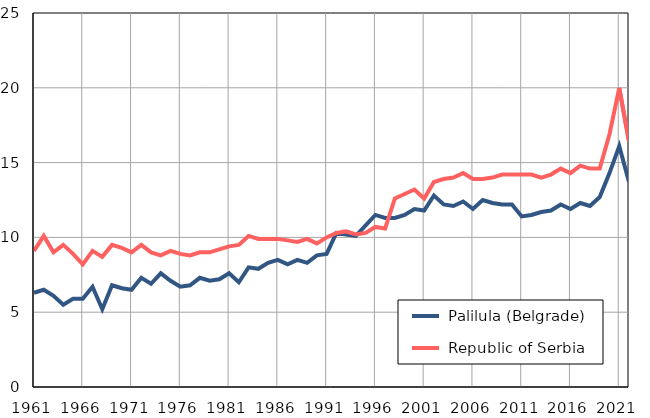
| Category |  Palilula (Belgrade) |  Republic of Serbia |
|---|---|---|
| 1961.0 | 6.3 | 9.1 |
| 1962.0 | 6.5 | 10.1 |
| 1963.0 | 6.1 | 9 |
| 1964.0 | 5.5 | 9.5 |
| 1965.0 | 5.9 | 8.9 |
| 1966.0 | 5.9 | 8.2 |
| 1967.0 | 6.7 | 9.1 |
| 1968.0 | 5.2 | 8.7 |
| 1969.0 | 6.8 | 9.5 |
| 1970.0 | 6.6 | 9.3 |
| 1971.0 | 6.5 | 9 |
| 1972.0 | 7.3 | 9.5 |
| 1973.0 | 6.9 | 9 |
| 1974.0 | 7.6 | 8.8 |
| 1975.0 | 7.1 | 9.1 |
| 1976.0 | 6.7 | 8.9 |
| 1977.0 | 6.8 | 8.8 |
| 1978.0 | 7.3 | 9 |
| 1979.0 | 7.1 | 9 |
| 1980.0 | 7.2 | 9.2 |
| 1981.0 | 7.6 | 9.4 |
| 1982.0 | 7 | 9.5 |
| 1983.0 | 8 | 10.1 |
| 1984.0 | 7.9 | 9.9 |
| 1985.0 | 8.3 | 9.9 |
| 1986.0 | 8.5 | 9.9 |
| 1987.0 | 8.2 | 9.8 |
| 1988.0 | 8.5 | 9.7 |
| 1989.0 | 8.3 | 9.9 |
| 1990.0 | 8.8 | 9.6 |
| 1991.0 | 8.9 | 10 |
| 1992.0 | 10.3 | 10.3 |
| 1993.0 | 10.2 | 10.4 |
| 1994.0 | 10.1 | 10.2 |
| 1995.0 | 10.8 | 10.3 |
| 1996.0 | 11.5 | 10.7 |
| 1997.0 | 11.3 | 10.6 |
| 1998.0 | 11.3 | 12.6 |
| 1999.0 | 11.5 | 12.9 |
| 2000.0 | 11.9 | 13.2 |
| 2001.0 | 11.8 | 12.6 |
| 2002.0 | 12.8 | 13.7 |
| 2003.0 | 12.2 | 13.9 |
| 2004.0 | 12.1 | 14 |
| 2005.0 | 12.4 | 14.3 |
| 2006.0 | 11.9 | 13.9 |
| 2007.0 | 12.5 | 13.9 |
| 2008.0 | 12.3 | 14 |
| 2009.0 | 12.2 | 14.2 |
| 2010.0 | 12.2 | 14.2 |
| 2011.0 | 11.4 | 14.2 |
| 2012.0 | 11.5 | 14.2 |
| 2013.0 | 11.7 | 14 |
| 2014.0 | 11.8 | 14.2 |
| 2015.0 | 12.2 | 14.6 |
| 2016.0 | 11.9 | 14.3 |
| 2017.0 | 12.3 | 14.8 |
| 2018.0 | 12.1 | 14.6 |
| 2019.0 | 12.7 | 14.6 |
| 2020.0 | 14.3 | 16.9 |
| 2021.0 | 16.1 | 20 |
| 2022.0 | 13.7 | 16.4 |